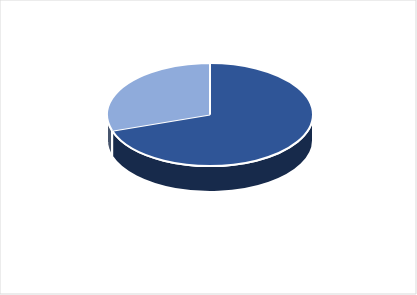
| Category | Series 0 |
|---|---|
| PRESUPUESTO VIGENTE PARA 2023 | 26198811 |
| PRESUPUESTO EJECUTADO  | 11271803.19 |
| PORCENTAJE DE EJECUCIÓN  | 0.43 |